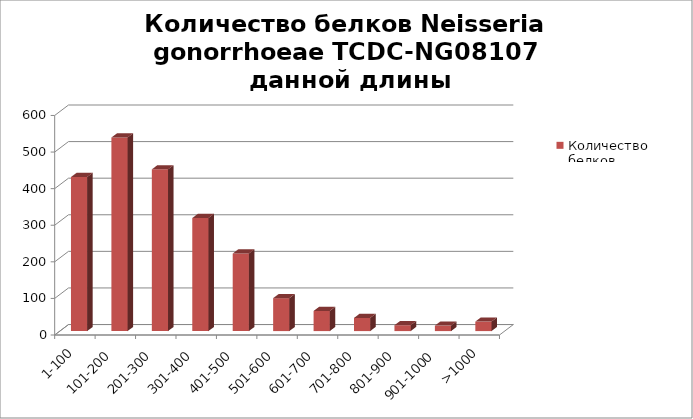
| Category | Количество белков |
|---|---|
| 1-100 | 421 |
| 101-200 | 529 |
| 201-300 | 442 |
| 301-400 | 309 |
| 401-500 | 212 |
| 501-600 | 90 |
| 601-700 | 55 |
| 701-800 | 36 |
| 801-900 | 16 |
| 901-1000 | 15 |
| >1000 | 26 |